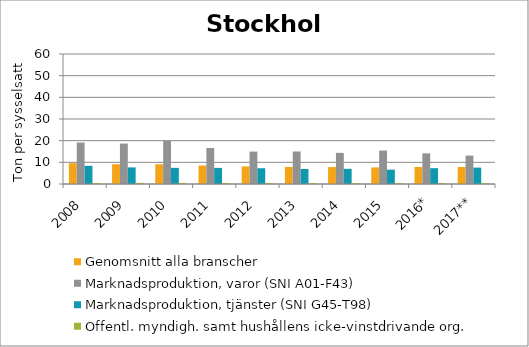
| Category | Genomsnitt alla branscher | Marknadsproduktion, varor (SNI A01-F43) | Marknadsproduktion, tjänster (SNI G45-T98) | Offentl. myndigh. samt hushållens icke-vinstdrivande org. |
|---|---|---|---|---|
| 2008 | 9.607 | 19.13 | 8.405 | 0.474 |
| 2009 | 9.111 | 18.664 | 7.665 | 0.528 |
| 2010 | 9.088 | 19.985 | 7.455 | 0.503 |
| 2011 | 8.519 | 16.619 | 7.431 | 0.473 |
| 2012 | 8.109 | 14.965 | 7.279 | 0.48 |
| 2013 | 7.882 | 15.011 | 6.931 | 0.441 |
| 2014 | 7.813 | 14.371 | 7.002 | 0.421 |
| 2015 | 7.646 | 15.432 | 6.619 | 0.417 |
| 2016* | 7.856 | 14.153 | 7.309 | 0.404 |
| 2017** | 7.851 | 13.119 | 7.563 | 0.388 |